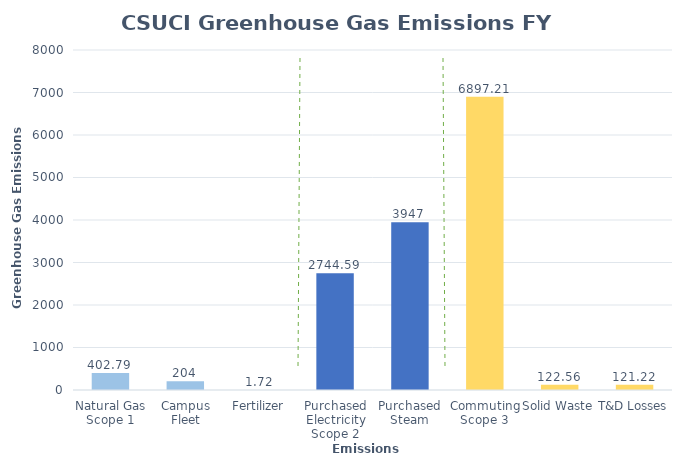
| Category | GHG MTCDE |
|---|---|
| 0 | 402.79 |
| 1 | 204 |
| 2 | 1.72 |
| 3 | 2744.59 |
| 4 | 3947 |
| 5 | 6897.21 |
| 6 | 122.56 |
| 7 | 121.22 |